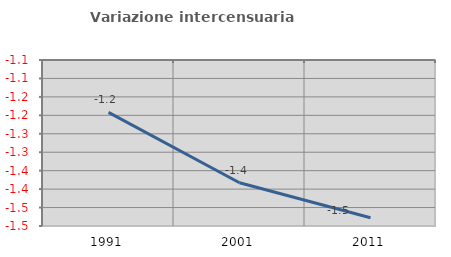
| Category | Variazione intercensuaria annua |
|---|---|
| 1991.0 | -1.192 |
| 2001.0 | -1.383 |
| 2011.0 | -1.478 |